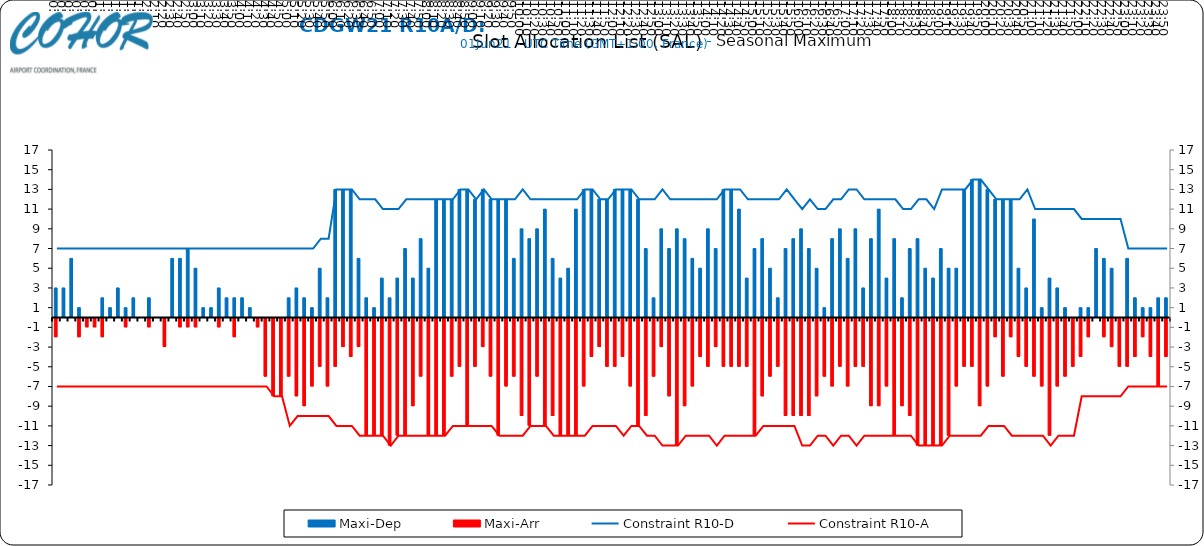
| Category | Maxi-Dep | Maxi-Arr |
|---|---|---|
| 0.0 | 3 | -2 |
| 0.006944444444444444 | 3 | 0 |
| 0.013888888888888888 | 6 | 0 |
| 0.020833333333333332 | 1 | -2 |
| 0.027777777777777776 | 0 | -1 |
| 0.034722222222222224 | 0 | -1 |
| 0.041666666666666664 | 2 | -2 |
| 0.04861111111111111 | 1 | 0 |
| 0.05555555555555555 | 3 | 0 |
| 0.0625 | 1 | -1 |
| 0.06944444444444443 | 2 | 0 |
| 0.0763888888888889 | 0 | 0 |
| 0.08333333333333333 | 2 | -1 |
| 0.09027777777777778 | 0 | 0 |
| 0.09722222222222222 | 0 | -3 |
| 0.10416666666666667 | 6 | 0 |
| 0.1111111111111111 | 6 | -1 |
| 0.11805555555555557 | 7 | -1 |
| 0.125 | 5 | -1 |
| 0.13194444444444445 | 1 | 0 |
| 0.1388888888888889 | 1 | 0 |
| 0.14583333333333334 | 3 | -1 |
| 0.15277777777777776 | 2 | 0 |
| 0.15972222222222224 | 2 | -2 |
| 0.16666666666666666 | 2 | 0 |
| 0.17361111111111113 | 1 | 0 |
| 0.18055555555555555 | 0 | -1 |
| 0.1875 | 0 | -6 |
| 0.19444444444444445 | 0 | -8 |
| 0.20138888888888887 | 0 | -8 |
| 0.20833333333333334 | 2 | -6 |
| 0.2152777777777778 | 3 | -8 |
| 0.2222222222222222 | 2 | -9 |
| 0.22916666666666666 | 1 | -7 |
| 0.23611111111111113 | 5 | -5 |
| 0.24305555555555555 | 2 | -7 |
| 0.25 | 13 | -5 |
| 0.2569444444444445 | 13 | -3 |
| 0.2638888888888889 | 13 | -4 |
| 0.2708333333333333 | 6 | -3 |
| 0.2777777777777778 | 2 | -12 |
| 0.2847222222222222 | 1 | -12 |
| 0.2916666666666667 | 4 | -12 |
| 0.2986111111111111 | 2 | -13 |
| 0.3055555555555555 | 4 | -12 |
| 0.3125 | 7 | -12 |
| 0.3194444444444445 | 4 | -9 |
| 0.3263888888888889 | 8 | -6 |
| 0.3333333333333333 | 5 | -12 |
| 0.34027777777777773 | 12 | -12 |
| 0.34722222222222227 | 12 | -12 |
| 0.3541666666666667 | 12 | -6 |
| 0.3611111111111111 | 13 | -5 |
| 0.3680555555555556 | 13 | -11 |
| 0.375 | 12 | -5 |
| 0.3819444444444444 | 13 | -3 |
| 0.3888888888888889 | 12 | -6 |
| 0.3958333333333333 | 12 | -12 |
| 0.40277777777777773 | 12 | -7 |
| 0.40972222222222227 | 6 | -6 |
| 0.4166666666666667 | 9 | -10 |
| 0.4236111111111111 | 8 | -11 |
| 0.4305555555555556 | 9 | -6 |
| 0.4375 | 11 | -11 |
| 0.4444444444444444 | 6 | -10 |
| 0.4513888888888889 | 4 | -12 |
| 0.4583333333333333 | 5 | -12 |
| 0.46527777777777773 | 11 | -12 |
| 0.47222222222222227 | 13 | -7 |
| 0.4791666666666667 | 13 | -4 |
| 0.4861111111111111 | 12 | -3 |
| 0.4930555555555556 | 12 | -5 |
| 0.5 | 13 | -5 |
| 0.5069444444444444 | 13 | -4 |
| 0.513888888888889 | 13 | -7 |
| 0.5208333333333334 | 12 | -11 |
| 0.5277777777777778 | 7 | -10 |
| 0.5347222222222222 | 2 | -6 |
| 0.5416666666666666 | 9 | -3 |
| 0.548611111111111 | 7 | -8 |
| 0.5555555555555556 | 9 | -13 |
| 0.5625 | 8 | -9 |
| 0.5694444444444444 | 6 | -7 |
| 0.576388888888889 | 5 | -4 |
| 0.5833333333333334 | 9 | -5 |
| 0.5902777777777778 | 7 | -3 |
| 0.5972222222222222 | 13 | -5 |
| 0.6041666666666666 | 13 | -5 |
| 0.611111111111111 | 11 | -5 |
| 0.6180555555555556 | 4 | -5 |
| 0.625 | 7 | -12 |
| 0.6319444444444444 | 8 | -8 |
| 0.638888888888889 | 5 | -6 |
| 0.6458333333333334 | 2 | -5 |
| 0.6527777777777778 | 7 | -10 |
| 0.6597222222222222 | 8 | -10 |
| 0.6666666666666666 | 9 | -10 |
| 0.6736111111111112 | 7 | -10 |
| 0.6805555555555555 | 5 | -8 |
| 0.6875 | 1 | -6 |
| 0.6944444444444445 | 8 | -7 |
| 0.7013888888888888 | 9 | -5 |
| 0.7083333333333334 | 6 | -7 |
| 0.7152777777777778 | 9 | -5 |
| 0.7222222222222222 | 3 | -5 |
| 0.7291666666666666 | 8 | -9 |
| 0.7361111111111112 | 11 | -9 |
| 0.7430555555555555 | 4 | -7 |
| 0.75 | 8 | -12 |
| 0.7569444444444445 | 2 | -9 |
| 0.7638888888888888 | 7 | -10 |
| 0.7708333333333334 | 8 | -13 |
| 0.7777777777777778 | 5 | -13 |
| 0.7847222222222222 | 4 | -13 |
| 0.7916666666666666 | 7 | -13 |
| 0.7986111111111112 | 5 | -12 |
| 0.8055555555555555 | 5 | -7 |
| 0.8125 | 13 | -5 |
| 0.8194444444444445 | 14 | -5 |
| 0.8263888888888888 | 14 | -9 |
| 0.8333333333333334 | 13 | -7 |
| 0.8402777777777778 | 12 | -2 |
| 0.8472222222222222 | 12 | -6 |
| 0.8541666666666666 | 12 | -2 |
| 0.8611111111111112 | 5 | -4 |
| 0.8680555555555555 | 3 | -5 |
| 0.875 | 10 | -6 |
| 0.8819444444444445 | 1 | -7 |
| 0.8888888888888888 | 4 | -12 |
| 0.8958333333333334 | 3 | -7 |
| 0.9027777777777778 | 1 | -6 |
| 0.9097222222222222 | 0 | -5 |
| 0.9166666666666666 | 1 | -4 |
| 0.9236111111111112 | 1 | -2 |
| 0.9305555555555555 | 7 | 0 |
| 0.9375 | 6 | -2 |
| 0.9444444444444445 | 5 | -3 |
| 0.9513888888888888 | 0 | -5 |
| 0.9583333333333334 | 6 | -5 |
| 0.9652777777777778 | 2 | -4 |
| 0.9722222222222222 | 1 | -2 |
| 0.9791666666666666 | 1 | -4 |
| 0.9861111111111112 | 2 | -7 |
| 0.9930555555555555 | 2 | -4 |